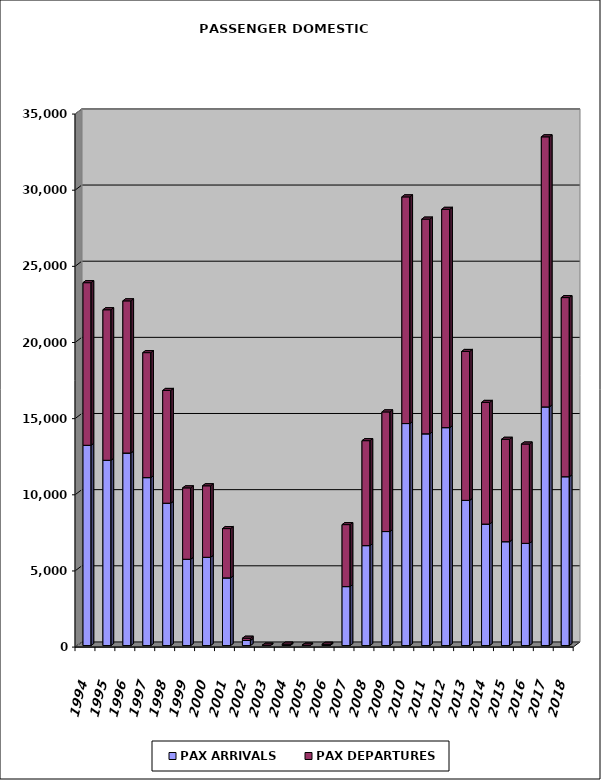
| Category | PAX ARRIVALS | PAX DEPARTURES |
|---|---|---|
| 1994.0 | 13150 | 10676 |
| 1995.0 | 12166 | 9882 |
| 1996.0 | 12642 | 9990 |
| 1997.0 | 11028 | 8205 |
| 1998.0 | 9348 | 7402 |
| 1999.0 | 5668 | 4686 |
| 2000.0 | 5796 | 4694 |
| 2001.0 | 4444 | 3236 |
| 2002.0 | 334 | 147 |
| 2003.0 | 9 | 13 |
| 2004.0 | 41 | 50 |
| 2005.0 | 16 | 3 |
| 2006.0 | 44 | 39 |
| 2007.0 | 3872 | 4069 |
| 2008.0 | 6563 | 6890 |
| 2009.0 | 7487 | 7854 |
| 2010.0 | 14578 | 14882 |
| 2011.0 | 13905 | 14094 |
| 2012.0 | 14310 | 14331 |
| 2013.0 | 9535 | 9774 |
| 2014.0 | 7977 | 7987 |
| 2015.0 | 6821 | 6721 |
| 2016.0 | 6712 | 6520 |
| 2017.0 | 15671 | 17732 |
| 2018.0 | 11088 | 11760 |